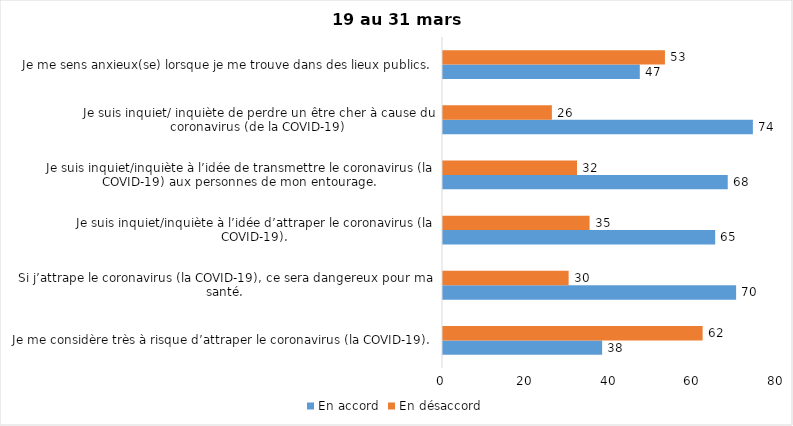
| Category | En accord | En désaccord |
|---|---|---|
| Je me considère très à risque d’attraper le coronavirus (la COVID-19). | 38 | 62 |
| Si j’attrape le coronavirus (la COVID-19), ce sera dangereux pour ma santé. | 70 | 30 |
| Je suis inquiet/inquiète à l’idée d’attraper le coronavirus (la COVID-19). | 65 | 35 |
| Je suis inquiet/inquiète à l’idée de transmettre le coronavirus (la COVID-19) aux personnes de mon entourage. | 68 | 32 |
| Je suis inquiet/ inquiète de perdre un être cher à cause du coronavirus (de la COVID-19) | 74 | 26 |
| Je me sens anxieux(se) lorsque je me trouve dans des lieux publics. | 47 | 53 |